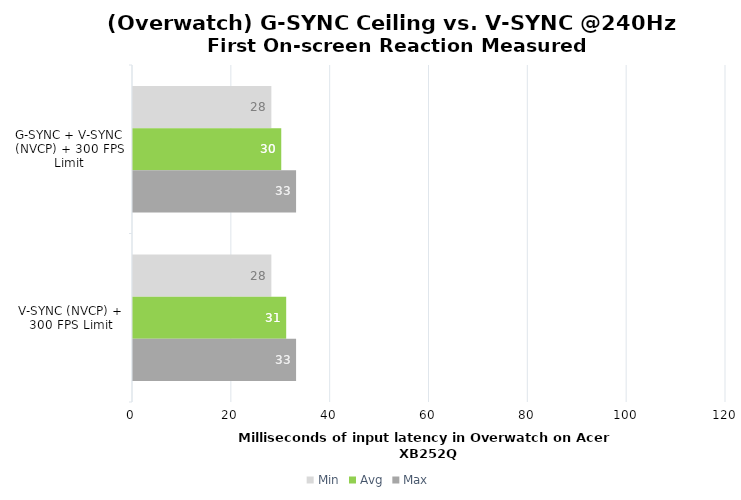
| Category | Min | Avg | Max |
|---|---|---|---|
| G-SYNC + V-SYNC (NVCP) + 300 FPS Limit | 28 | 30 | 33 |
| V-SYNC (NVCP) + 300 FPS Limit | 28 | 31 | 33 |